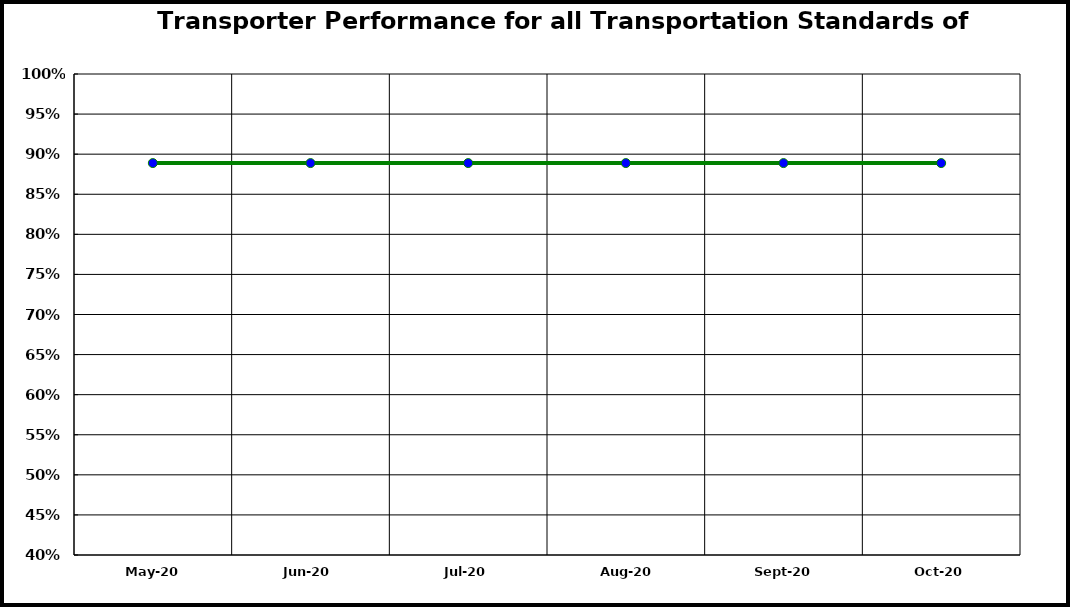
| Category | Performance |
|---|---|
| 2020-05-01 | 0.889 |
| 2020-06-01 | 0.889 |
| 2020-07-01 | 0.889 |
| 2020-08-01 | 0.889 |
| 2020-09-01 | 0.889 |
| 2020-10-01 | 0.889 |